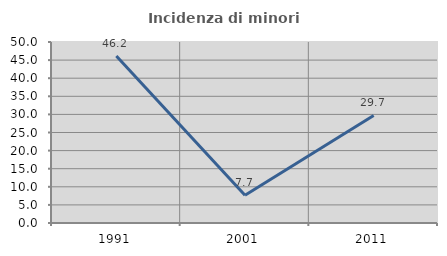
| Category | Incidenza di minori stranieri |
|---|---|
| 1991.0 | 46.154 |
| 2001.0 | 7.692 |
| 2011.0 | 29.697 |